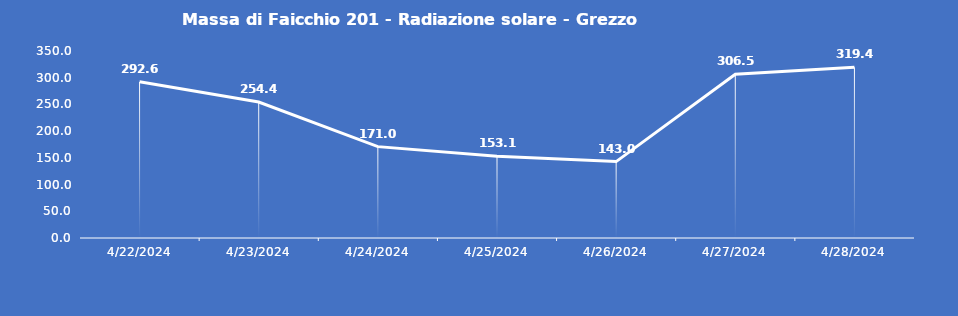
| Category | Massa di Faicchio 201 - Radiazione solare - Grezzo (W/m2) |
|---|---|
| 4/22/24 | 292.6 |
| 4/23/24 | 254.4 |
| 4/24/24 | 171 |
| 4/25/24 | 153.1 |
| 4/26/24 | 143 |
| 4/27/24 | 306.5 |
| 4/28/24 | 319.4 |